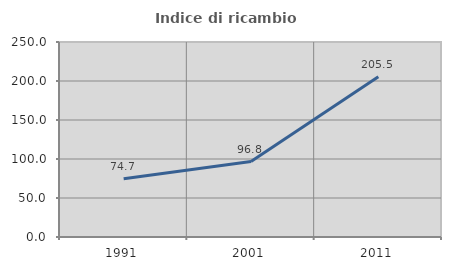
| Category | Indice di ricambio occupazionale  |
|---|---|
| 1991.0 | 74.737 |
| 2001.0 | 96.755 |
| 2011.0 | 205.47 |